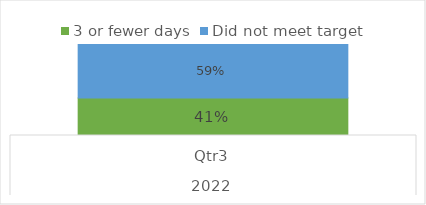
| Category | 3 or fewer days | Did not meet target |
|---|---|---|
| 0 | 0.412 | 0.588 |